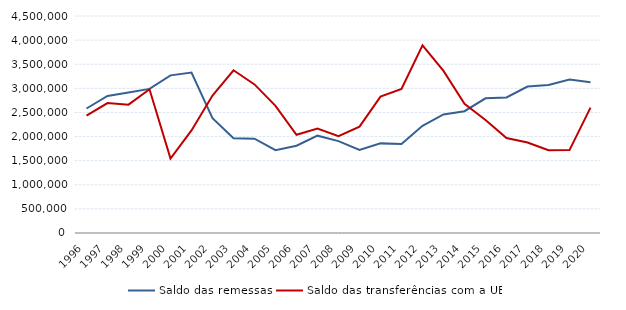
| Category | Saldo das remessas | Saldo das transferências com a UE |
|---|---|---|
| 1996.0 | 2581600 | 2435680 |
| 1997.0 | 2843130 | 2694270 |
| 1998.0 | 2914820 | 2661320 |
| 1999.0 | 2988410 | 2980390 |
| 2000.0 | 3269160 | 1543310 |
| 2001.0 | 3326730 | 2126650 |
| 2002.0 | 2382380 | 2851540 |
| 2003.0 | 1966680 | 3374680 |
| 2004.0 | 1956570 | 3081440 |
| 2005.0 | 1717260 | 2636820 |
| 2006.0 | 1810500 | 2036230 |
| 2007.0 | 2018420 | 2167970 |
| 2008.0 | 1904680 | 2005930 |
| 2009.0 | 1722660 | 2206830 |
| 2010.0 | 1858560 | 2827060 |
| 2011.0 | 1844870 | 2987290 |
| 2012.0 | 2223930 | 3892440 |
| 2013.0 | 2459730 | 3360920 |
| 2014.0 | 2525900 | 2680010 |
| 2015.0 | 2793010 | 2342530 |
| 2016.0 | 2809870 | 1970170 |
| 2017.0 | 3036510 | 1876900 |
| 2018.0 | 3071290 | 1718090 |
| 2019.0 | 3183710 | 1719420 |
| 2020.0 | 3126630 | 2599240 |